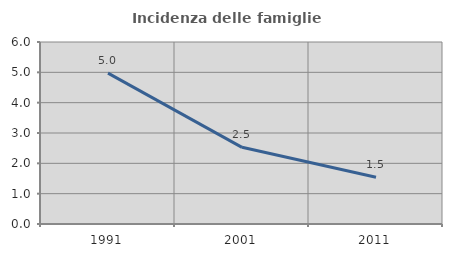
| Category | Incidenza delle famiglie numerose |
|---|---|
| 1991.0 | 4.972 |
| 2001.0 | 2.528 |
| 2011.0 | 1.538 |